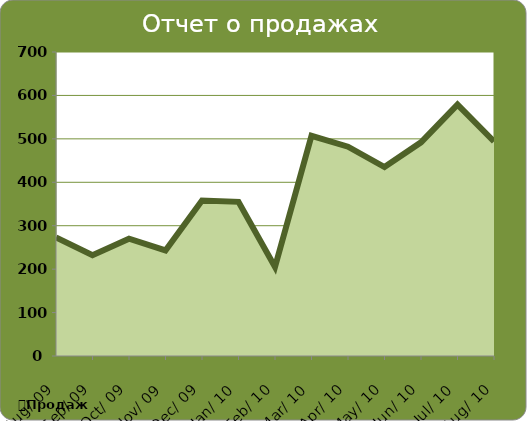
| Category | Продажи |
|---|---|
| 2009-08-01 | 273 |
| 2009-09-01 | 232 |
| 2009-10-01 | 270 |
| 2009-11-01 | 243 |
| 2009-12-01 | 358 |
| 2010-01-01 | 355 |
| 2010-02-01 | 205 |
| 2010-03-01 | 507 |
| 2010-04-01 | 482 |
| 2010-05-01 | 435 |
| 2010-06-01 | 492 |
| 2010-07-01 | 579 |
| 2010-08-01 | 494 |